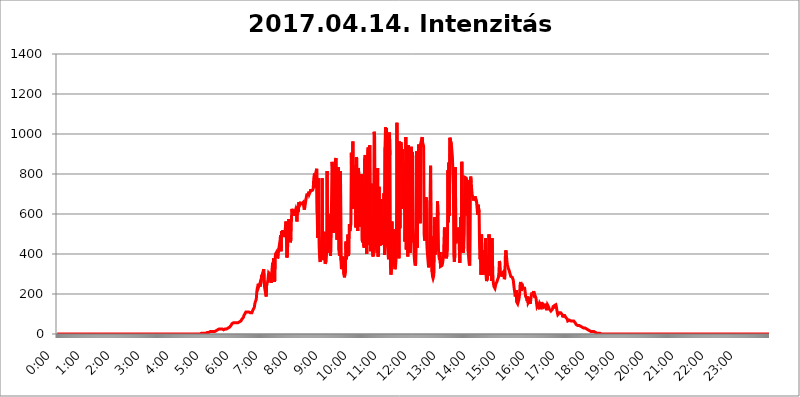
| Category | 2017.04.14. Intenzitás [W/m^2] |
|---|---|
| 0.0 | 0 |
| 0.0006944444444444445 | 0 |
| 0.001388888888888889 | 0 |
| 0.0020833333333333333 | 0 |
| 0.002777777777777778 | 0 |
| 0.003472222222222222 | 0 |
| 0.004166666666666667 | 0 |
| 0.004861111111111111 | 0 |
| 0.005555555555555556 | 0 |
| 0.0062499999999999995 | 0 |
| 0.006944444444444444 | 0 |
| 0.007638888888888889 | 0 |
| 0.008333333333333333 | 0 |
| 0.009027777777777779 | 0 |
| 0.009722222222222222 | 0 |
| 0.010416666666666666 | 0 |
| 0.011111111111111112 | 0 |
| 0.011805555555555555 | 0 |
| 0.012499999999999999 | 0 |
| 0.013194444444444444 | 0 |
| 0.013888888888888888 | 0 |
| 0.014583333333333332 | 0 |
| 0.015277777777777777 | 0 |
| 0.015972222222222224 | 0 |
| 0.016666666666666666 | 0 |
| 0.017361111111111112 | 0 |
| 0.018055555555555557 | 0 |
| 0.01875 | 0 |
| 0.019444444444444445 | 0 |
| 0.02013888888888889 | 0 |
| 0.020833333333333332 | 0 |
| 0.02152777777777778 | 0 |
| 0.022222222222222223 | 0 |
| 0.02291666666666667 | 0 |
| 0.02361111111111111 | 0 |
| 0.024305555555555556 | 0 |
| 0.024999999999999998 | 0 |
| 0.025694444444444447 | 0 |
| 0.02638888888888889 | 0 |
| 0.027083333333333334 | 0 |
| 0.027777777777777776 | 0 |
| 0.02847222222222222 | 0 |
| 0.029166666666666664 | 0 |
| 0.029861111111111113 | 0 |
| 0.030555555555555555 | 0 |
| 0.03125 | 0 |
| 0.03194444444444445 | 0 |
| 0.03263888888888889 | 0 |
| 0.03333333333333333 | 0 |
| 0.034027777777777775 | 0 |
| 0.034722222222222224 | 0 |
| 0.035416666666666666 | 0 |
| 0.036111111111111115 | 0 |
| 0.03680555555555556 | 0 |
| 0.0375 | 0 |
| 0.03819444444444444 | 0 |
| 0.03888888888888889 | 0 |
| 0.03958333333333333 | 0 |
| 0.04027777777777778 | 0 |
| 0.04097222222222222 | 0 |
| 0.041666666666666664 | 0 |
| 0.042361111111111106 | 0 |
| 0.04305555555555556 | 0 |
| 0.043750000000000004 | 0 |
| 0.044444444444444446 | 0 |
| 0.04513888888888889 | 0 |
| 0.04583333333333334 | 0 |
| 0.04652777777777778 | 0 |
| 0.04722222222222222 | 0 |
| 0.04791666666666666 | 0 |
| 0.04861111111111111 | 0 |
| 0.049305555555555554 | 0 |
| 0.049999999999999996 | 0 |
| 0.05069444444444445 | 0 |
| 0.051388888888888894 | 0 |
| 0.052083333333333336 | 0 |
| 0.05277777777777778 | 0 |
| 0.05347222222222222 | 0 |
| 0.05416666666666667 | 0 |
| 0.05486111111111111 | 0 |
| 0.05555555555555555 | 0 |
| 0.05625 | 0 |
| 0.05694444444444444 | 0 |
| 0.057638888888888885 | 0 |
| 0.05833333333333333 | 0 |
| 0.05902777777777778 | 0 |
| 0.059722222222222225 | 0 |
| 0.06041666666666667 | 0 |
| 0.061111111111111116 | 0 |
| 0.06180555555555556 | 0 |
| 0.0625 | 0 |
| 0.06319444444444444 | 0 |
| 0.06388888888888888 | 0 |
| 0.06458333333333334 | 0 |
| 0.06527777777777778 | 0 |
| 0.06597222222222222 | 0 |
| 0.06666666666666667 | 0 |
| 0.06736111111111111 | 0 |
| 0.06805555555555555 | 0 |
| 0.06874999999999999 | 0 |
| 0.06944444444444443 | 0 |
| 0.07013888888888889 | 0 |
| 0.07083333333333333 | 0 |
| 0.07152777777777779 | 0 |
| 0.07222222222222223 | 0 |
| 0.07291666666666667 | 0 |
| 0.07361111111111111 | 0 |
| 0.07430555555555556 | 0 |
| 0.075 | 0 |
| 0.07569444444444444 | 0 |
| 0.0763888888888889 | 0 |
| 0.07708333333333334 | 0 |
| 0.07777777777777778 | 0 |
| 0.07847222222222222 | 0 |
| 0.07916666666666666 | 0 |
| 0.0798611111111111 | 0 |
| 0.08055555555555556 | 0 |
| 0.08125 | 0 |
| 0.08194444444444444 | 0 |
| 0.08263888888888889 | 0 |
| 0.08333333333333333 | 0 |
| 0.08402777777777777 | 0 |
| 0.08472222222222221 | 0 |
| 0.08541666666666665 | 0 |
| 0.08611111111111112 | 0 |
| 0.08680555555555557 | 0 |
| 0.08750000000000001 | 0 |
| 0.08819444444444445 | 0 |
| 0.08888888888888889 | 0 |
| 0.08958333333333333 | 0 |
| 0.09027777777777778 | 0 |
| 0.09097222222222222 | 0 |
| 0.09166666666666667 | 0 |
| 0.09236111111111112 | 0 |
| 0.09305555555555556 | 0 |
| 0.09375 | 0 |
| 0.09444444444444444 | 0 |
| 0.09513888888888888 | 0 |
| 0.09583333333333333 | 0 |
| 0.09652777777777777 | 0 |
| 0.09722222222222222 | 0 |
| 0.09791666666666667 | 0 |
| 0.09861111111111111 | 0 |
| 0.09930555555555555 | 0 |
| 0.09999999999999999 | 0 |
| 0.10069444444444443 | 0 |
| 0.1013888888888889 | 0 |
| 0.10208333333333335 | 0 |
| 0.10277777777777779 | 0 |
| 0.10347222222222223 | 0 |
| 0.10416666666666667 | 0 |
| 0.10486111111111111 | 0 |
| 0.10555555555555556 | 0 |
| 0.10625 | 0 |
| 0.10694444444444444 | 0 |
| 0.1076388888888889 | 0 |
| 0.10833333333333334 | 0 |
| 0.10902777777777778 | 0 |
| 0.10972222222222222 | 0 |
| 0.1111111111111111 | 0 |
| 0.11180555555555556 | 0 |
| 0.11180555555555556 | 0 |
| 0.1125 | 0 |
| 0.11319444444444444 | 0 |
| 0.11388888888888889 | 0 |
| 0.11458333333333333 | 0 |
| 0.11527777777777777 | 0 |
| 0.11597222222222221 | 0 |
| 0.11666666666666665 | 0 |
| 0.1173611111111111 | 0 |
| 0.11805555555555557 | 0 |
| 0.11944444444444445 | 0 |
| 0.12013888888888889 | 0 |
| 0.12083333333333333 | 0 |
| 0.12152777777777778 | 0 |
| 0.12222222222222223 | 0 |
| 0.12291666666666667 | 0 |
| 0.12291666666666667 | 0 |
| 0.12361111111111112 | 0 |
| 0.12430555555555556 | 0 |
| 0.125 | 0 |
| 0.12569444444444444 | 0 |
| 0.12638888888888888 | 0 |
| 0.12708333333333333 | 0 |
| 0.16875 | 0 |
| 0.12847222222222224 | 0 |
| 0.12916666666666668 | 0 |
| 0.12986111111111112 | 0 |
| 0.13055555555555556 | 0 |
| 0.13125 | 0 |
| 0.13194444444444445 | 0 |
| 0.1326388888888889 | 0 |
| 0.13333333333333333 | 0 |
| 0.13402777777777777 | 0 |
| 0.13402777777777777 | 0 |
| 0.13472222222222222 | 0 |
| 0.13541666666666666 | 0 |
| 0.1361111111111111 | 0 |
| 0.13749999999999998 | 0 |
| 0.13819444444444443 | 0 |
| 0.1388888888888889 | 0 |
| 0.13958333333333334 | 0 |
| 0.14027777777777778 | 0 |
| 0.14097222222222222 | 0 |
| 0.14166666666666666 | 0 |
| 0.1423611111111111 | 0 |
| 0.14305555555555557 | 0 |
| 0.14375000000000002 | 0 |
| 0.14444444444444446 | 0 |
| 0.1451388888888889 | 0 |
| 0.1451388888888889 | 0 |
| 0.14652777777777778 | 0 |
| 0.14722222222222223 | 0 |
| 0.14791666666666667 | 0 |
| 0.1486111111111111 | 0 |
| 0.14930555555555555 | 0 |
| 0.15 | 0 |
| 0.15069444444444444 | 0 |
| 0.15138888888888888 | 0 |
| 0.15208333333333332 | 0 |
| 0.15277777777777776 | 0 |
| 0.15347222222222223 | 0 |
| 0.15416666666666667 | 0 |
| 0.15486111111111112 | 0 |
| 0.15555555555555556 | 0 |
| 0.15625 | 0 |
| 0.15694444444444444 | 0 |
| 0.15763888888888888 | 0 |
| 0.15833333333333333 | 0 |
| 0.15902777777777777 | 0 |
| 0.15972222222222224 | 0 |
| 0.16041666666666668 | 0 |
| 0.16111111111111112 | 0 |
| 0.16180555555555556 | 0 |
| 0.1625 | 0 |
| 0.16319444444444445 | 0 |
| 0.1638888888888889 | 0 |
| 0.16458333333333333 | 0 |
| 0.16527777777777777 | 0 |
| 0.16597222222222222 | 0 |
| 0.16666666666666666 | 0 |
| 0.1673611111111111 | 0 |
| 0.16805555555555554 | 0 |
| 0.16874999999999998 | 0 |
| 0.16944444444444443 | 0 |
| 0.17013888888888887 | 0 |
| 0.1708333333333333 | 0 |
| 0.17152777777777775 | 0 |
| 0.17222222222222225 | 0 |
| 0.1729166666666667 | 0 |
| 0.17361111111111113 | 0 |
| 0.17430555555555557 | 0 |
| 0.17500000000000002 | 0 |
| 0.17569444444444446 | 0 |
| 0.1763888888888889 | 0 |
| 0.17708333333333334 | 0 |
| 0.17777777777777778 | 0 |
| 0.17847222222222223 | 0 |
| 0.17916666666666667 | 0 |
| 0.1798611111111111 | 0 |
| 0.18055555555555555 | 0 |
| 0.18125 | 0 |
| 0.18194444444444444 | 0 |
| 0.1826388888888889 | 0 |
| 0.18333333333333335 | 0 |
| 0.1840277777777778 | 0 |
| 0.18472222222222223 | 0 |
| 0.18541666666666667 | 0 |
| 0.18611111111111112 | 0 |
| 0.18680555555555556 | 0 |
| 0.1875 | 0 |
| 0.18819444444444444 | 0 |
| 0.18888888888888888 | 0 |
| 0.18958333333333333 | 0 |
| 0.19027777777777777 | 0 |
| 0.1909722222222222 | 0 |
| 0.19166666666666665 | 0 |
| 0.19236111111111112 | 0 |
| 0.19305555555555554 | 0 |
| 0.19375 | 0 |
| 0.19444444444444445 | 0 |
| 0.1951388888888889 | 0 |
| 0.19583333333333333 | 0 |
| 0.19652777777777777 | 0 |
| 0.19722222222222222 | 0 |
| 0.19791666666666666 | 0 |
| 0.1986111111111111 | 0 |
| 0.19930555555555554 | 0 |
| 0.19999999999999998 | 0 |
| 0.20069444444444443 | 0 |
| 0.20138888888888887 | 3.525 |
| 0.2020833333333333 | 3.525 |
| 0.2027777777777778 | 3.525 |
| 0.2034722222222222 | 3.525 |
| 0.2041666666666667 | 3.525 |
| 0.20486111111111113 | 3.525 |
| 0.20555555555555557 | 3.525 |
| 0.20625000000000002 | 3.525 |
| 0.20694444444444446 | 3.525 |
| 0.2076388888888889 | 3.525 |
| 0.20833333333333334 | 3.525 |
| 0.20902777777777778 | 7.887 |
| 0.20972222222222223 | 7.887 |
| 0.21041666666666667 | 7.887 |
| 0.2111111111111111 | 7.887 |
| 0.21180555555555555 | 7.887 |
| 0.2125 | 7.887 |
| 0.21319444444444444 | 12.257 |
| 0.2138888888888889 | 12.257 |
| 0.21458333333333335 | 12.257 |
| 0.2152777777777778 | 12.257 |
| 0.21597222222222223 | 12.257 |
| 0.21666666666666667 | 12.257 |
| 0.21736111111111112 | 12.257 |
| 0.21805555555555556 | 12.257 |
| 0.21875 | 12.257 |
| 0.21944444444444444 | 12.257 |
| 0.22013888888888888 | 12.257 |
| 0.22083333333333333 | 12.257 |
| 0.22152777777777777 | 12.257 |
| 0.2222222222222222 | 16.636 |
| 0.22291666666666665 | 16.636 |
| 0.2236111111111111 | 21.024 |
| 0.22430555555555556 | 21.024 |
| 0.225 | 21.024 |
| 0.22569444444444445 | 21.024 |
| 0.2263888888888889 | 25.419 |
| 0.22708333333333333 | 25.419 |
| 0.22777777777777777 | 25.419 |
| 0.22847222222222222 | 25.419 |
| 0.22916666666666666 | 25.419 |
| 0.2298611111111111 | 25.419 |
| 0.23055555555555554 | 25.419 |
| 0.23124999999999998 | 25.419 |
| 0.23194444444444443 | 25.419 |
| 0.23263888888888887 | 21.024 |
| 0.2333333333333333 | 21.024 |
| 0.2340277777777778 | 25.419 |
| 0.2347222222222222 | 25.419 |
| 0.2354166666666667 | 25.419 |
| 0.23611111111111113 | 25.419 |
| 0.23680555555555557 | 25.419 |
| 0.23750000000000002 | 25.419 |
| 0.23819444444444446 | 25.419 |
| 0.2388888888888889 | 29.823 |
| 0.23958333333333334 | 29.823 |
| 0.24027777777777778 | 29.823 |
| 0.24097222222222223 | 34.234 |
| 0.24166666666666667 | 34.234 |
| 0.2423611111111111 | 38.653 |
| 0.24305555555555555 | 38.653 |
| 0.24375 | 43.079 |
| 0.24444444444444446 | 47.511 |
| 0.24513888888888888 | 51.951 |
| 0.24583333333333335 | 56.398 |
| 0.2465277777777778 | 56.398 |
| 0.24722222222222223 | 56.398 |
| 0.24791666666666667 | 56.398 |
| 0.24861111111111112 | 56.398 |
| 0.24930555555555556 | 56.398 |
| 0.25 | 56.398 |
| 0.25069444444444444 | 56.398 |
| 0.2513888888888889 | 56.398 |
| 0.2520833333333333 | 56.398 |
| 0.25277777777777777 | 56.398 |
| 0.2534722222222222 | 56.398 |
| 0.25416666666666665 | 56.398 |
| 0.2548611111111111 | 56.398 |
| 0.2555555555555556 | 60.85 |
| 0.25625000000000003 | 60.85 |
| 0.2569444444444445 | 65.31 |
| 0.2576388888888889 | 65.31 |
| 0.25833333333333336 | 69.775 |
| 0.2590277777777778 | 74.246 |
| 0.25972222222222224 | 74.246 |
| 0.2604166666666667 | 78.722 |
| 0.2611111111111111 | 83.205 |
| 0.26180555555555557 | 92.184 |
| 0.2625 | 96.682 |
| 0.26319444444444445 | 101.184 |
| 0.2638888888888889 | 105.69 |
| 0.26458333333333334 | 110.201 |
| 0.2652777777777778 | 105.69 |
| 0.2659722222222222 | 110.201 |
| 0.26666666666666666 | 110.201 |
| 0.2673611111111111 | 114.716 |
| 0.26805555555555555 | 114.716 |
| 0.26875 | 110.201 |
| 0.26944444444444443 | 110.201 |
| 0.2701388888888889 | 105.69 |
| 0.2708333333333333 | 105.69 |
| 0.27152777777777776 | 105.69 |
| 0.2722222222222222 | 101.184 |
| 0.27291666666666664 | 105.69 |
| 0.2736111111111111 | 110.201 |
| 0.2743055555555555 | 119.235 |
| 0.27499999999999997 | 119.235 |
| 0.27569444444444446 | 123.758 |
| 0.27638888888888885 | 132.814 |
| 0.27708333333333335 | 150.964 |
| 0.2777777777777778 | 160.056 |
| 0.27847222222222223 | 160.056 |
| 0.2791666666666667 | 173.709 |
| 0.2798611111111111 | 210.182 |
| 0.28055555555555556 | 228.436 |
| 0.28125 | 237.564 |
| 0.28194444444444444 | 251.251 |
| 0.2826388888888889 | 237.564 |
| 0.2833333333333333 | 242.127 |
| 0.28402777777777777 | 251.251 |
| 0.2847222222222222 | 237.564 |
| 0.28541666666666665 | 242.127 |
| 0.28611111111111115 | 274.047 |
| 0.28680555555555554 | 296.808 |
| 0.28750000000000003 | 287.709 |
| 0.2881944444444445 | 305.898 |
| 0.2888888888888889 | 305.898 |
| 0.28958333333333336 | 324.052 |
| 0.2902777777777778 | 255.813 |
| 0.29097222222222224 | 228.436 |
| 0.2916666666666667 | 233 |
| 0.2923611111111111 | 201.058 |
| 0.29305555555555557 | 187.378 |
| 0.29375 | 251.251 |
| 0.29444444444444445 | 246.689 |
| 0.2951388888888889 | 260.373 |
| 0.29583333333333334 | 255.813 |
| 0.2965277777777778 | 305.898 |
| 0.2972222222222222 | 305.898 |
| 0.29791666666666666 | 310.44 |
| 0.2986111111111111 | 296.808 |
| 0.29930555555555555 | 296.808 |
| 0.3 | 255.813 |
| 0.30069444444444443 | 296.808 |
| 0.3013888888888889 | 328.584 |
| 0.3020833333333333 | 355.712 |
| 0.30277777777777776 | 342.162 |
| 0.3034722222222222 | 378.224 |
| 0.30416666666666664 | 296.808 |
| 0.3048611111111111 | 260.373 |
| 0.3055555555555555 | 378.224 |
| 0.30624999999999997 | 400.638 |
| 0.3069444444444444 | 400.638 |
| 0.3076388888888889 | 409.574 |
| 0.30833333333333335 | 396.164 |
| 0.3090277777777778 | 378.224 |
| 0.30972222222222223 | 387.202 |
| 0.3104166666666667 | 418.492 |
| 0.3111111111111111 | 418.492 |
| 0.31180555555555556 | 422.943 |
| 0.3125 | 467.187 |
| 0.31319444444444444 | 493.475 |
| 0.3138888888888889 | 414.035 |
| 0.3145833333333333 | 515.223 |
| 0.31527777777777777 | 506.542 |
| 0.3159722222222222 | 497.836 |
| 0.31666666666666665 | 519.555 |
| 0.31736111111111115 | 515.223 |
| 0.31805555555555554 | 484.735 |
| 0.31875000000000003 | 493.475 |
| 0.3194444444444445 | 502.192 |
| 0.3201388888888889 | 541.121 |
| 0.32083333333333336 | 562.53 |
| 0.3215277777777778 | 558.261 |
| 0.32222222222222224 | 382.715 |
| 0.3229166666666667 | 418.492 |
| 0.3236111111111111 | 471.582 |
| 0.32430555555555557 | 462.786 |
| 0.325 | 575.299 |
| 0.32569444444444445 | 462.786 |
| 0.3263888888888889 | 541.121 |
| 0.32708333333333334 | 458.38 |
| 0.3277777777777778 | 480.356 |
| 0.3284722222222222 | 575.299 |
| 0.32916666666666666 | 625.784 |
| 0.3298611111111111 | 609.062 |
| 0.33055555555555555 | 596.45 |
| 0.33125 | 621.613 |
| 0.33194444444444443 | 592.233 |
| 0.3326388888888889 | 592.233 |
| 0.3333333333333333 | 604.864 |
| 0.3340277777777778 | 617.436 |
| 0.3347222222222222 | 625.784 |
| 0.3354166666666667 | 617.436 |
| 0.3361111111111111 | 562.53 |
| 0.3368055555555556 | 629.948 |
| 0.33749999999999997 | 638.256 |
| 0.33819444444444446 | 609.062 |
| 0.33888888888888885 | 658.909 |
| 0.33958333333333335 | 642.4 |
| 0.34027777777777773 | 642.4 |
| 0.34097222222222223 | 654.791 |
| 0.3416666666666666 | 650.667 |
| 0.3423611111111111 | 650.667 |
| 0.3430555555555555 | 650.667 |
| 0.34375 | 654.791 |
| 0.3444444444444445 | 650.667 |
| 0.3451388888888889 | 658.909 |
| 0.3458333333333334 | 634.105 |
| 0.34652777777777777 | 621.613 |
| 0.34722222222222227 | 634.105 |
| 0.34791666666666665 | 650.667 |
| 0.34861111111111115 | 667.123 |
| 0.34930555555555554 | 683.473 |
| 0.35000000000000003 | 695.666 |
| 0.3506944444444444 | 699.717 |
| 0.3513888888888889 | 691.608 |
| 0.3520833333333333 | 695.666 |
| 0.3527777777777778 | 711.832 |
| 0.3534722222222222 | 699.717 |
| 0.3541666666666667 | 703.762 |
| 0.3548611111111111 | 711.832 |
| 0.35555555555555557 | 723.889 |
| 0.35625 | 715.858 |
| 0.35694444444444445 | 719.877 |
| 0.3576388888888889 | 715.858 |
| 0.35833333333333334 | 719.877 |
| 0.3590277777777778 | 727.896 |
| 0.3597222222222222 | 775.492 |
| 0.36041666666666666 | 795.074 |
| 0.3611111111111111 | 802.868 |
| 0.36180555555555555 | 731.896 |
| 0.3625 | 727.896 |
| 0.36319444444444443 | 814.519 |
| 0.3638888888888889 | 826.123 |
| 0.3645833333333333 | 604.864 |
| 0.3652777777777778 | 480.356 |
| 0.3659722222222222 | 779.42 |
| 0.3666666666666667 | 575.299 |
| 0.3673611111111111 | 436.27 |
| 0.3680555555555556 | 378.224 |
| 0.36874999999999997 | 360.221 |
| 0.36944444444444446 | 360.221 |
| 0.37013888888888885 | 405.108 |
| 0.37083333333333335 | 489.108 |
| 0.37152777777777773 | 779.42 |
| 0.37222222222222223 | 414.035 |
| 0.3729166666666666 | 369.23 |
| 0.3736111111111111 | 396.164 |
| 0.3743055555555555 | 510.885 |
| 0.375 | 387.202 |
| 0.3756944444444445 | 351.198 |
| 0.3763888888888889 | 346.682 |
| 0.3770833333333334 | 364.728 |
| 0.37777777777777777 | 409.574 |
| 0.37847222222222227 | 814.519 |
| 0.37916666666666665 | 475.972 |
| 0.37986111111111115 | 600.661 |
| 0.38055555555555554 | 480.356 |
| 0.38125000000000003 | 558.261 |
| 0.3819444444444444 | 405.108 |
| 0.3826388888888889 | 515.223 |
| 0.3833333333333333 | 391.685 |
| 0.3840277777777778 | 532.513 |
| 0.3847222222222222 | 667.123 |
| 0.3854166666666667 | 860.676 |
| 0.3861111111111111 | 864.493 |
| 0.38680555555555557 | 795.074 |
| 0.3875 | 506.542 |
| 0.38819444444444445 | 502.192 |
| 0.3888888888888889 | 771.559 |
| 0.38958333333333334 | 837.682 |
| 0.3902777777777778 | 872.114 |
| 0.3909722222222222 | 879.719 |
| 0.39166666666666666 | 515.223 |
| 0.3923611111111111 | 471.582 |
| 0.39305555555555555 | 467.187 |
| 0.39375 | 604.864 |
| 0.39444444444444443 | 833.834 |
| 0.3951388888888889 | 418.492 |
| 0.3958333333333333 | 391.685 |
| 0.3965277777777778 | 414.035 |
| 0.3972222222222222 | 814.519 |
| 0.3979166666666667 | 369.23 |
| 0.3986111111111111 | 324.052 |
| 0.3993055555555556 | 328.584 |
| 0.39999999999999997 | 369.23 |
| 0.40069444444444446 | 387.202 |
| 0.40138888888888885 | 382.715 |
| 0.40208333333333335 | 296.808 |
| 0.40277777777777773 | 283.156 |
| 0.40347222222222223 | 283.156 |
| 0.4041666666666666 | 314.98 |
| 0.4048611111111111 | 462.786 |
| 0.4055555555555555 | 373.729 |
| 0.40625 | 400.638 |
| 0.4069444444444445 | 409.574 |
| 0.4076388888888889 | 497.836 |
| 0.4083333333333334 | 391.685 |
| 0.40902777777777777 | 405.108 |
| 0.40972222222222227 | 549.704 |
| 0.41041666666666665 | 515.223 |
| 0.41111111111111115 | 532.513 |
| 0.41180555555555554 | 549.704 |
| 0.41250000000000003 | 906.223 |
| 0.4131944444444444 | 646.537 |
| 0.4138888888888889 | 719.877 |
| 0.4145833333333333 | 962.555 |
| 0.4152777777777778 | 625.784 |
| 0.4159722222222222 | 719.877 |
| 0.4166666666666667 | 845.365 |
| 0.4173611111111111 | 849.199 |
| 0.41805555555555557 | 751.803 |
| 0.41875 | 532.513 |
| 0.41944444444444445 | 883.516 |
| 0.4201388888888889 | 875.918 |
| 0.42083333333333334 | 545.416 |
| 0.4215277777777778 | 515.223 |
| 0.4222222222222222 | 829.981 |
| 0.42291666666666666 | 802.868 |
| 0.4236111111111111 | 767.62 |
| 0.42430555555555555 | 691.608 |
| 0.425 | 536.82 |
| 0.42569444444444443 | 671.22 |
| 0.4263888888888889 | 646.537 |
| 0.4270833333333333 | 798.974 |
| 0.4277777777777778 | 467.187 |
| 0.4284722222222222 | 458.38 |
| 0.4291666666666667 | 519.555 |
| 0.4298611111111111 | 440.702 |
| 0.4305555555555556 | 431.833 |
| 0.43124999999999997 | 875.918 |
| 0.43194444444444446 | 894.885 |
| 0.43263888888888885 | 436.27 |
| 0.43333333333333335 | 894.885 |
| 0.43402777777777773 | 400.638 |
| 0.43472222222222223 | 759.723 |
| 0.4354166666666666 | 909.996 |
| 0.4361111111111111 | 932.576 |
| 0.4368055555555555 | 458.38 |
| 0.4375 | 445.129 |
| 0.4381944444444445 | 943.832 |
| 0.4388888888888889 | 604.864 |
| 0.4395833333333334 | 414.035 |
| 0.44027777777777777 | 751.803 |
| 0.44097222222222227 | 497.836 |
| 0.44166666666666665 | 467.187 |
| 0.44236111111111115 | 396.164 |
| 0.44305555555555554 | 387.202 |
| 0.44375000000000003 | 449.551 |
| 0.4444444444444444 | 1011.118 |
| 0.4451388888888889 | 988.714 |
| 0.4458333333333333 | 571.049 |
| 0.4465277777777778 | 471.582 |
| 0.4472222222222222 | 440.702 |
| 0.4479166666666667 | 445.129 |
| 0.4486111111111111 | 405.108 |
| 0.44930555555555557 | 829.981 |
| 0.45 | 387.202 |
| 0.45069444444444445 | 414.035 |
| 0.4513888888888889 | 735.89 |
| 0.45208333333333334 | 458.38 |
| 0.4527777777777778 | 440.702 |
| 0.4534722222222222 | 493.475 |
| 0.45416666666666666 | 675.311 |
| 0.4548611111111111 | 471.582 |
| 0.45555555555555555 | 471.582 |
| 0.45625 | 484.735 |
| 0.45694444444444443 | 445.129 |
| 0.4576388888888889 | 445.129 |
| 0.4583333333333333 | 703.762 |
| 0.4590277777777778 | 396.164 |
| 0.4597222222222222 | 932.576 |
| 0.4604166666666667 | 1033.537 |
| 0.4611111111111111 | 925.06 |
| 0.4618055555555556 | 1029.798 |
| 0.46249999999999997 | 600.661 |
| 0.46319444444444446 | 440.702 |
| 0.46388888888888885 | 405.108 |
| 0.46458333333333335 | 373.729 |
| 0.46527777777777773 | 445.129 |
| 0.46597222222222223 | 1007.383 |
| 0.4666666666666666 | 894.885 |
| 0.4673611111111111 | 333.113 |
| 0.4680555555555555 | 296.808 |
| 0.46875 | 328.584 |
| 0.4694444444444445 | 562.53 |
| 0.4701388888888889 | 391.685 |
| 0.4708333333333334 | 373.729 |
| 0.47152777777777777 | 400.638 |
| 0.47222222222222227 | 523.88 |
| 0.47291666666666665 | 342.162 |
| 0.47361111111111115 | 324.052 |
| 0.47430555555555554 | 333.113 |
| 0.47500000000000003 | 364.728 |
| 0.4756944444444444 | 409.574 |
| 0.4763888888888889 | 1056.004 |
| 0.4770833333333333 | 683.473 |
| 0.4777777777777778 | 467.187 |
| 0.4784722222222222 | 898.668 |
| 0.4791666666666667 | 378.224 |
| 0.4798611111111111 | 962.555 |
| 0.48055555555555557 | 528.2 |
| 0.48125 | 894.885 |
| 0.48194444444444445 | 958.814 |
| 0.4826388888888889 | 940.082 |
| 0.48333333333333334 | 887.309 |
| 0.4840277777777778 | 925.06 |
| 0.4847222222222222 | 625.784 |
| 0.48541666666666666 | 671.22 |
| 0.4861111111111111 | 864.493 |
| 0.48680555555555555 | 739.877 |
| 0.4875 | 462.786 |
| 0.48819444444444443 | 553.986 |
| 0.4888888888888889 | 984.98 |
| 0.4895833333333333 | 422.943 |
| 0.4902777777777778 | 795.074 |
| 0.4909722222222222 | 445.129 |
| 0.4916666666666667 | 387.202 |
| 0.4923611111111111 | 943.832 |
| 0.4930555555555556 | 743.859 |
| 0.49374999999999997 | 699.717 |
| 0.49444444444444446 | 418.492 |
| 0.49513888888888885 | 405.108 |
| 0.49583333333333335 | 506.542 |
| 0.49652777777777773 | 936.33 |
| 0.49722222222222223 | 458.38 |
| 0.4979166666666666 | 909.996 |
| 0.4986111111111111 | 883.516 |
| 0.4993055555555555 | 528.2 |
| 0.5 | 462.786 |
| 0.5006944444444444 | 387.202 |
| 0.5013888888888889 | 355.712 |
| 0.5020833333333333 | 342.162 |
| 0.5027777777777778 | 351.198 |
| 0.5034722222222222 | 462.786 |
| 0.5041666666666667 | 913.766 |
| 0.5048611111111111 | 431.833 |
| 0.5055555555555555 | 719.877 |
| 0.50625 | 853.029 |
| 0.5069444444444444 | 947.58 |
| 0.5076388888888889 | 947.58 |
| 0.5083333333333333 | 675.311 |
| 0.5090277777777777 | 553.986 |
| 0.5097222222222222 | 951.327 |
| 0.5104166666666666 | 951.327 |
| 0.5111111111111112 | 973.772 |
| 0.5118055555555555 | 984.98 |
| 0.5125000000000001 | 955.071 |
| 0.5131944444444444 | 947.58 |
| 0.513888888888889 | 936.33 |
| 0.5145833333333333 | 497.836 |
| 0.5152777777777778 | 467.187 |
| 0.5159722222222222 | 467.187 |
| 0.5166666666666667 | 549.704 |
| 0.517361111111111 | 683.473 |
| 0.5180555555555556 | 480.356 |
| 0.5187499999999999 | 422.943 |
| 0.5194444444444445 | 391.685 |
| 0.5201388888888888 | 360.221 |
| 0.5208333333333334 | 333.113 |
| 0.5215277777777778 | 346.682 |
| 0.5222222222222223 | 337.639 |
| 0.5229166666666667 | 667.123 |
| 0.5236111111111111 | 841.526 |
| 0.5243055555555556 | 396.164 |
| 0.525 | 489.108 |
| 0.5256944444444445 | 310.44 |
| 0.5263888888888889 | 287.709 |
| 0.5270833333333333 | 278.603 |
| 0.5277777777777778 | 287.709 |
| 0.5284722222222222 | 314.98 |
| 0.5291666666666667 | 583.779 |
| 0.5298611111111111 | 396.164 |
| 0.5305555555555556 | 427.39 |
| 0.53125 | 545.416 |
| 0.5319444444444444 | 427.39 |
| 0.5326388888888889 | 532.513 |
| 0.5333333333333333 | 663.019 |
| 0.5340277777777778 | 592.233 |
| 0.5347222222222222 | 418.492 |
| 0.5354166666666667 | 387.202 |
| 0.5361111111111111 | 369.23 |
| 0.5368055555555555 | 409.574 |
| 0.5375 | 337.639 |
| 0.5381944444444444 | 342.162 |
| 0.5388888888888889 | 337.639 |
| 0.5395833333333333 | 342.162 |
| 0.5402777777777777 | 351.198 |
| 0.5409722222222222 | 369.23 |
| 0.5416666666666666 | 382.715 |
| 0.5423611111111112 | 378.224 |
| 0.5430555555555555 | 532.513 |
| 0.5437500000000001 | 382.715 |
| 0.5444444444444444 | 400.638 |
| 0.545138888888889 | 391.685 |
| 0.5458333333333333 | 378.224 |
| 0.5465277777777778 | 396.164 |
| 0.5472222222222222 | 422.943 |
| 0.5479166666666667 | 818.392 |
| 0.548611111111111 | 558.261 |
| 0.5493055555555556 | 856.855 |
| 0.5499999999999999 | 592.233 |
| 0.5506944444444445 | 981.244 |
| 0.5513888888888888 | 977.508 |
| 0.5520833333333334 | 981.244 |
| 0.5527777777777778 | 947.58 |
| 0.5534722222222223 | 917.534 |
| 0.5541666666666667 | 887.309 |
| 0.5548611111111111 | 818.392 |
| 0.5555555555555556 | 755.766 |
| 0.55625 | 391.685 |
| 0.5569444444444445 | 360.221 |
| 0.5576388888888889 | 396.164 |
| 0.5583333333333333 | 833.834 |
| 0.5590277777777778 | 453.968 |
| 0.5597222222222222 | 449.551 |
| 0.5604166666666667 | 449.551 |
| 0.5611111111111111 | 480.356 |
| 0.5618055555555556 | 497.836 |
| 0.5625 | 532.513 |
| 0.5631944444444444 | 523.88 |
| 0.5638888888888889 | 431.833 |
| 0.5645833333333333 | 355.712 |
| 0.5652777777777778 | 355.712 |
| 0.5659722222222222 | 583.779 |
| 0.5666666666666667 | 409.574 |
| 0.5673611111111111 | 860.676 |
| 0.5680555555555555 | 549.704 |
| 0.56875 | 566.793 |
| 0.5694444444444444 | 405.108 |
| 0.5701388888888889 | 436.27 |
| 0.5708333333333333 | 506.542 |
| 0.5715277777777777 | 783.342 |
| 0.5722222222222222 | 787.258 |
| 0.5729166666666666 | 783.342 |
| 0.5736111111111112 | 779.42 |
| 0.5743055555555555 | 771.559 |
| 0.5750000000000001 | 592.233 |
| 0.5756944444444444 | 767.62 |
| 0.576388888888889 | 414.035 |
| 0.5770833333333333 | 378.224 |
| 0.5777777777777778 | 351.198 |
| 0.5784722222222222 | 342.162 |
| 0.5791666666666667 | 751.803 |
| 0.579861111111111 | 787.258 |
| 0.5805555555555556 | 759.723 |
| 0.5812499999999999 | 723.889 |
| 0.5819444444444445 | 695.666 |
| 0.5826388888888888 | 687.544 |
| 0.5833333333333334 | 679.395 |
| 0.5840277777777778 | 667.123 |
| 0.5847222222222223 | 683.473 |
| 0.5854166666666667 | 675.311 |
| 0.5861111111111111 | 687.544 |
| 0.5868055555555556 | 687.544 |
| 0.5875 | 683.473 |
| 0.5881944444444445 | 658.909 |
| 0.5888888888888889 | 658.909 |
| 0.5895833333333333 | 596.45 |
| 0.5902777777777778 | 646.537 |
| 0.5909722222222222 | 650.667 |
| 0.5916666666666667 | 609.062 |
| 0.5923611111111111 | 431.833 |
| 0.5930555555555556 | 373.729 |
| 0.59375 | 431.833 |
| 0.5944444444444444 | 296.808 |
| 0.5951388888888889 | 497.836 |
| 0.5958333333333333 | 314.98 |
| 0.5965277777777778 | 418.492 |
| 0.5972222222222222 | 296.808 |
| 0.5979166666666667 | 292.259 |
| 0.5986111111111111 | 409.574 |
| 0.5993055555555555 | 387.202 |
| 0.6 | 405.108 |
| 0.6006944444444444 | 480.356 |
| 0.6013888888888889 | 296.808 |
| 0.6020833333333333 | 264.932 |
| 0.6027777777777777 | 264.932 |
| 0.6034722222222222 | 278.603 |
| 0.6041666666666666 | 391.685 |
| 0.6048611111111112 | 292.259 |
| 0.6055555555555555 | 497.836 |
| 0.6062500000000001 | 458.38 |
| 0.6069444444444444 | 475.972 |
| 0.607638888888889 | 440.702 |
| 0.6083333333333333 | 422.943 |
| 0.6090277777777778 | 264.932 |
| 0.6097222222222222 | 480.356 |
| 0.6104166666666667 | 369.23 |
| 0.611111111111111 | 274.047 |
| 0.6118055555555556 | 251.251 |
| 0.6124999999999999 | 237.564 |
| 0.6131944444444445 | 233 |
| 0.6138888888888888 | 228.436 |
| 0.6145833333333334 | 233 |
| 0.6152777777777778 | 251.251 |
| 0.6159722222222223 | 255.813 |
| 0.6166666666666667 | 260.373 |
| 0.6173611111111111 | 269.49 |
| 0.6180555555555556 | 274.047 |
| 0.61875 | 283.156 |
| 0.6194444444444445 | 305.898 |
| 0.6201388888888889 | 364.728 |
| 0.6208333333333333 | 351.198 |
| 0.6215277777777778 | 310.44 |
| 0.6222222222222222 | 287.709 |
| 0.6229166666666667 | 287.709 |
| 0.6236111111111111 | 301.354 |
| 0.6243055555555556 | 305.898 |
| 0.625 | 296.808 |
| 0.6256944444444444 | 310.44 |
| 0.6263888888888889 | 292.259 |
| 0.6270833333333333 | 274.047 |
| 0.6277777777777778 | 283.156 |
| 0.6284722222222222 | 387.202 |
| 0.6291666666666667 | 418.492 |
| 0.6298611111111111 | 396.164 |
| 0.6305555555555555 | 369.23 |
| 0.63125 | 346.682 |
| 0.6319444444444444 | 337.639 |
| 0.6326388888888889 | 328.584 |
| 0.6333333333333333 | 324.052 |
| 0.6340277777777777 | 314.98 |
| 0.6347222222222222 | 305.898 |
| 0.6354166666666666 | 296.808 |
| 0.6361111111111112 | 287.709 |
| 0.6368055555555555 | 287.709 |
| 0.6375000000000001 | 287.709 |
| 0.6381944444444444 | 283.156 |
| 0.638888888888889 | 278.603 |
| 0.6395833333333333 | 269.49 |
| 0.6402777777777778 | 269.49 |
| 0.6409722222222222 | 223.873 |
| 0.6416666666666667 | 210.182 |
| 0.642361111111111 | 187.378 |
| 0.6430555555555556 | 187.378 |
| 0.6437499999999999 | 219.309 |
| 0.6444444444444445 | 160.056 |
| 0.6451388888888888 | 155.509 |
| 0.6458333333333334 | 150.964 |
| 0.6465277777777778 | 155.509 |
| 0.6472222222222223 | 169.156 |
| 0.6479166666666667 | 182.82 |
| 0.6486111111111111 | 210.182 |
| 0.6493055555555556 | 251.251 |
| 0.65 | 260.373 |
| 0.6506944444444445 | 214.746 |
| 0.6513888888888889 | 251.251 |
| 0.6520833333333333 | 246.689 |
| 0.6527777777777778 | 237.564 |
| 0.6534722222222222 | 228.436 |
| 0.6541666666666667 | 223.873 |
| 0.6548611111111111 | 228.436 |
| 0.6555555555555556 | 228.436 |
| 0.65625 | 210.182 |
| 0.6569444444444444 | 187.378 |
| 0.6576388888888889 | 182.82 |
| 0.6583333333333333 | 178.264 |
| 0.6590277777777778 | 164.605 |
| 0.6597222222222222 | 187.378 |
| 0.6604166666666667 | 155.509 |
| 0.6611111111111111 | 155.509 |
| 0.6618055555555555 | 155.509 |
| 0.6625 | 169.156 |
| 0.6631944444444444 | 150.964 |
| 0.6638888888888889 | 164.605 |
| 0.6645833333333333 | 182.82 |
| 0.6652777777777777 | 201.058 |
| 0.6659722222222222 | 205.62 |
| 0.6666666666666666 | 201.058 |
| 0.6673611111111111 | 201.058 |
| 0.6680555555555556 | 214.746 |
| 0.6687500000000001 | 210.182 |
| 0.6694444444444444 | 182.82 |
| 0.6701388888888888 | 191.937 |
| 0.6708333333333334 | 187.378 |
| 0.6715277777777778 | 178.264 |
| 0.6722222222222222 | 155.509 |
| 0.6729166666666666 | 137.347 |
| 0.6736111111111112 | 137.347 |
| 0.6743055555555556 | 146.423 |
| 0.6749999999999999 | 150.964 |
| 0.6756944444444444 | 150.964 |
| 0.6763888888888889 | 123.758 |
| 0.6770833333333334 | 150.964 |
| 0.6777777777777777 | 155.509 |
| 0.6784722222222223 | 141.884 |
| 0.6791666666666667 | 160.056 |
| 0.6798611111111111 | 137.347 |
| 0.6805555555555555 | 155.509 |
| 0.68125 | 146.423 |
| 0.6819444444444445 | 132.814 |
| 0.6826388888888889 | 128.284 |
| 0.6833333333333332 | 137.347 |
| 0.6840277777777778 | 137.347 |
| 0.6847222222222222 | 141.884 |
| 0.6854166666666667 | 150.964 |
| 0.686111111111111 | 119.235 |
| 0.6868055555555556 | 132.814 |
| 0.6875 | 146.423 |
| 0.6881944444444444 | 146.423 |
| 0.688888888888889 | 137.347 |
| 0.6895833333333333 | 141.884 |
| 0.6902777777777778 | 123.758 |
| 0.6909722222222222 | 119.235 |
| 0.6916666666666668 | 119.235 |
| 0.6923611111111111 | 114.716 |
| 0.6930555555555555 | 114.716 |
| 0.69375 | 119.235 |
| 0.6944444444444445 | 123.758 |
| 0.6951388888888889 | 123.758 |
| 0.6958333333333333 | 141.884 |
| 0.6965277777777777 | 128.284 |
| 0.6972222222222223 | 141.884 |
| 0.6979166666666666 | 146.423 |
| 0.6986111111111111 | 141.884 |
| 0.6993055555555556 | 146.423 |
| 0.7000000000000001 | 137.347 |
| 0.7006944444444444 | 119.235 |
| 0.7013888888888888 | 114.716 |
| 0.7020833333333334 | 96.682 |
| 0.7027777777777778 | 92.184 |
| 0.7034722222222222 | 92.184 |
| 0.7041666666666666 | 105.69 |
| 0.7048611111111112 | 105.69 |
| 0.7055555555555556 | 110.201 |
| 0.7062499999999999 | 105.69 |
| 0.7069444444444444 | 105.69 |
| 0.7076388888888889 | 101.184 |
| 0.7083333333333334 | 96.682 |
| 0.7090277777777777 | 83.205 |
| 0.7097222222222223 | 92.184 |
| 0.7104166666666667 | 92.184 |
| 0.7111111111111111 | 92.184 |
| 0.7118055555555555 | 92.184 |
| 0.7125 | 87.692 |
| 0.7131944444444445 | 83.205 |
| 0.7138888888888889 | 83.205 |
| 0.7145833333333332 | 78.722 |
| 0.7152777777777778 | 74.246 |
| 0.7159722222222222 | 65.31 |
| 0.7166666666666667 | 65.31 |
| 0.717361111111111 | 69.775 |
| 0.7180555555555556 | 69.775 |
| 0.71875 | 69.775 |
| 0.7194444444444444 | 65.31 |
| 0.720138888888889 | 65.31 |
| 0.7208333333333333 | 65.31 |
| 0.7215277777777778 | 65.31 |
| 0.7222222222222222 | 65.31 |
| 0.7229166666666668 | 65.31 |
| 0.7236111111111111 | 65.31 |
| 0.7243055555555555 | 65.31 |
| 0.725 | 65.31 |
| 0.7256944444444445 | 65.31 |
| 0.7263888888888889 | 56.398 |
| 0.7270833333333333 | 51.951 |
| 0.7277777777777777 | 47.511 |
| 0.7284722222222223 | 47.511 |
| 0.7291666666666666 | 47.511 |
| 0.7298611111111111 | 43.079 |
| 0.7305555555555556 | 43.079 |
| 0.7312500000000001 | 43.079 |
| 0.7319444444444444 | 43.079 |
| 0.7326388888888888 | 38.653 |
| 0.7333333333333334 | 38.653 |
| 0.7340277777777778 | 38.653 |
| 0.7347222222222222 | 38.653 |
| 0.7354166666666666 | 34.234 |
| 0.7361111111111112 | 34.234 |
| 0.7368055555555556 | 34.234 |
| 0.7374999999999999 | 34.234 |
| 0.7381944444444444 | 29.823 |
| 0.7388888888888889 | 29.823 |
| 0.7395833333333334 | 29.823 |
| 0.7402777777777777 | 29.823 |
| 0.7409722222222223 | 25.419 |
| 0.7416666666666667 | 25.419 |
| 0.7423611111111111 | 25.419 |
| 0.7430555555555555 | 21.024 |
| 0.74375 | 21.024 |
| 0.7444444444444445 | 21.024 |
| 0.7451388888888889 | 21.024 |
| 0.7458333333333332 | 21.024 |
| 0.7465277777777778 | 16.636 |
| 0.7472222222222222 | 16.636 |
| 0.7479166666666667 | 16.636 |
| 0.748611111111111 | 12.257 |
| 0.7493055555555556 | 12.257 |
| 0.75 | 12.257 |
| 0.7506944444444444 | 12.257 |
| 0.751388888888889 | 12.257 |
| 0.7520833333333333 | 12.257 |
| 0.7527777777777778 | 12.257 |
| 0.7534722222222222 | 7.887 |
| 0.7541666666666668 | 7.887 |
| 0.7548611111111111 | 7.887 |
| 0.7555555555555555 | 7.887 |
| 0.75625 | 3.525 |
| 0.7569444444444445 | 3.525 |
| 0.7576388888888889 | 3.525 |
| 0.7583333333333333 | 3.525 |
| 0.7590277777777777 | 3.525 |
| 0.7597222222222223 | 3.525 |
| 0.7604166666666666 | 3.525 |
| 0.7611111111111111 | 3.525 |
| 0.7618055555555556 | 0 |
| 0.7625000000000001 | 0 |
| 0.7631944444444444 | 0 |
| 0.7638888888888888 | 0 |
| 0.7645833333333334 | 0 |
| 0.7652777777777778 | 0 |
| 0.7659722222222222 | 0 |
| 0.7666666666666666 | 0 |
| 0.7673611111111112 | 0 |
| 0.7680555555555556 | 0 |
| 0.7687499999999999 | 0 |
| 0.7694444444444444 | 0 |
| 0.7701388888888889 | 0 |
| 0.7708333333333334 | 0 |
| 0.7715277777777777 | 0 |
| 0.7722222222222223 | 0 |
| 0.7729166666666667 | 0 |
| 0.7736111111111111 | 0 |
| 0.7743055555555555 | 0 |
| 0.775 | 0 |
| 0.7756944444444445 | 0 |
| 0.7763888888888889 | 0 |
| 0.7770833333333332 | 0 |
| 0.7777777777777778 | 0 |
| 0.7784722222222222 | 0 |
| 0.7791666666666667 | 0 |
| 0.779861111111111 | 0 |
| 0.7805555555555556 | 0 |
| 0.78125 | 0 |
| 0.7819444444444444 | 0 |
| 0.782638888888889 | 0 |
| 0.7833333333333333 | 0 |
| 0.7840277777777778 | 0 |
| 0.7847222222222222 | 0 |
| 0.7854166666666668 | 0 |
| 0.7861111111111111 | 0 |
| 0.7868055555555555 | 0 |
| 0.7875 | 0 |
| 0.7881944444444445 | 0 |
| 0.7888888888888889 | 0 |
| 0.7895833333333333 | 0 |
| 0.7902777777777777 | 0 |
| 0.7909722222222223 | 0 |
| 0.7916666666666666 | 0 |
| 0.7923611111111111 | 0 |
| 0.7930555555555556 | 0 |
| 0.7937500000000001 | 0 |
| 0.7944444444444444 | 0 |
| 0.7951388888888888 | 0 |
| 0.7958333333333334 | 0 |
| 0.7965277777777778 | 0 |
| 0.7972222222222222 | 0 |
| 0.7979166666666666 | 0 |
| 0.7986111111111112 | 0 |
| 0.7993055555555556 | 0 |
| 0.7999999999999999 | 0 |
| 0.8006944444444444 | 0 |
| 0.8013888888888889 | 0 |
| 0.8020833333333334 | 0 |
| 0.8027777777777777 | 0 |
| 0.8034722222222223 | 0 |
| 0.8041666666666667 | 0 |
| 0.8048611111111111 | 0 |
| 0.8055555555555555 | 0 |
| 0.80625 | 0 |
| 0.8069444444444445 | 0 |
| 0.8076388888888889 | 0 |
| 0.8083333333333332 | 0 |
| 0.8090277777777778 | 0 |
| 0.8097222222222222 | 0 |
| 0.8104166666666667 | 0 |
| 0.811111111111111 | 0 |
| 0.8118055555555556 | 0 |
| 0.8125 | 0 |
| 0.8131944444444444 | 0 |
| 0.813888888888889 | 0 |
| 0.8145833333333333 | 0 |
| 0.8152777777777778 | 0 |
| 0.8159722222222222 | 0 |
| 0.8166666666666668 | 0 |
| 0.8173611111111111 | 0 |
| 0.8180555555555555 | 0 |
| 0.81875 | 0 |
| 0.8194444444444445 | 0 |
| 0.8201388888888889 | 0 |
| 0.8208333333333333 | 0 |
| 0.8215277777777777 | 0 |
| 0.8222222222222223 | 0 |
| 0.8229166666666666 | 0 |
| 0.8236111111111111 | 0 |
| 0.8243055555555556 | 0 |
| 0.8250000000000001 | 0 |
| 0.8256944444444444 | 0 |
| 0.8263888888888888 | 0 |
| 0.8270833333333334 | 0 |
| 0.8277777777777778 | 0 |
| 0.8284722222222222 | 0 |
| 0.8291666666666666 | 0 |
| 0.8298611111111112 | 0 |
| 0.8305555555555556 | 0 |
| 0.8312499999999999 | 0 |
| 0.8319444444444444 | 0 |
| 0.8326388888888889 | 0 |
| 0.8333333333333334 | 0 |
| 0.8340277777777777 | 0 |
| 0.8347222222222223 | 0 |
| 0.8354166666666667 | 0 |
| 0.8361111111111111 | 0 |
| 0.8368055555555555 | 0 |
| 0.8375 | 0 |
| 0.8381944444444445 | 0 |
| 0.8388888888888889 | 0 |
| 0.8395833333333332 | 0 |
| 0.8402777777777778 | 0 |
| 0.8409722222222222 | 0 |
| 0.8416666666666667 | 0 |
| 0.842361111111111 | 0 |
| 0.8430555555555556 | 0 |
| 0.84375 | 0 |
| 0.8444444444444444 | 0 |
| 0.845138888888889 | 0 |
| 0.8458333333333333 | 0 |
| 0.8465277777777778 | 0 |
| 0.8472222222222222 | 0 |
| 0.8479166666666668 | 0 |
| 0.8486111111111111 | 0 |
| 0.8493055555555555 | 0 |
| 0.85 | 0 |
| 0.8506944444444445 | 0 |
| 0.8513888888888889 | 0 |
| 0.8520833333333333 | 0 |
| 0.8527777777777777 | 0 |
| 0.8534722222222223 | 0 |
| 0.8541666666666666 | 0 |
| 0.8548611111111111 | 0 |
| 0.8555555555555556 | 0 |
| 0.8562500000000001 | 0 |
| 0.8569444444444444 | 0 |
| 0.8576388888888888 | 0 |
| 0.8583333333333334 | 0 |
| 0.8590277777777778 | 0 |
| 0.8597222222222222 | 0 |
| 0.8604166666666666 | 0 |
| 0.8611111111111112 | 0 |
| 0.8618055555555556 | 0 |
| 0.8624999999999999 | 0 |
| 0.8631944444444444 | 0 |
| 0.8638888888888889 | 0 |
| 0.8645833333333334 | 0 |
| 0.8652777777777777 | 0 |
| 0.8659722222222223 | 0 |
| 0.8666666666666667 | 0 |
| 0.8673611111111111 | 0 |
| 0.8680555555555555 | 0 |
| 0.86875 | 0 |
| 0.8694444444444445 | 0 |
| 0.8701388888888889 | 0 |
| 0.8708333333333332 | 0 |
| 0.8715277777777778 | 0 |
| 0.8722222222222222 | 0 |
| 0.8729166666666667 | 0 |
| 0.873611111111111 | 0 |
| 0.8743055555555556 | 0 |
| 0.875 | 0 |
| 0.8756944444444444 | 0 |
| 0.876388888888889 | 0 |
| 0.8770833333333333 | 0 |
| 0.8777777777777778 | 0 |
| 0.8784722222222222 | 0 |
| 0.8791666666666668 | 0 |
| 0.8798611111111111 | 0 |
| 0.8805555555555555 | 0 |
| 0.88125 | 0 |
| 0.8819444444444445 | 0 |
| 0.8826388888888889 | 0 |
| 0.8833333333333333 | 0 |
| 0.8840277777777777 | 0 |
| 0.8847222222222223 | 0 |
| 0.8854166666666666 | 0 |
| 0.8861111111111111 | 0 |
| 0.8868055555555556 | 0 |
| 0.8875000000000001 | 0 |
| 0.8881944444444444 | 0 |
| 0.8888888888888888 | 0 |
| 0.8895833333333334 | 0 |
| 0.8902777777777778 | 0 |
| 0.8909722222222222 | 0 |
| 0.8916666666666666 | 0 |
| 0.8923611111111112 | 0 |
| 0.8930555555555556 | 0 |
| 0.8937499999999999 | 0 |
| 0.8944444444444444 | 0 |
| 0.8951388888888889 | 0 |
| 0.8958333333333334 | 0 |
| 0.8965277777777777 | 0 |
| 0.8972222222222223 | 0 |
| 0.8979166666666667 | 0 |
| 0.8986111111111111 | 0 |
| 0.8993055555555555 | 0 |
| 0.9 | 0 |
| 0.9006944444444445 | 0 |
| 0.9013888888888889 | 0 |
| 0.9020833333333332 | 0 |
| 0.9027777777777778 | 0 |
| 0.9034722222222222 | 0 |
| 0.9041666666666667 | 0 |
| 0.904861111111111 | 0 |
| 0.9055555555555556 | 0 |
| 0.90625 | 0 |
| 0.9069444444444444 | 0 |
| 0.907638888888889 | 0 |
| 0.9083333333333333 | 0 |
| 0.9090277777777778 | 0 |
| 0.9097222222222222 | 0 |
| 0.9104166666666668 | 0 |
| 0.9111111111111111 | 0 |
| 0.9118055555555555 | 0 |
| 0.9125 | 0 |
| 0.9131944444444445 | 0 |
| 0.9138888888888889 | 0 |
| 0.9145833333333333 | 0 |
| 0.9152777777777777 | 0 |
| 0.9159722222222223 | 0 |
| 0.9166666666666666 | 0 |
| 0.9173611111111111 | 0 |
| 0.9180555555555556 | 0 |
| 0.9187500000000001 | 0 |
| 0.9194444444444444 | 0 |
| 0.9201388888888888 | 0 |
| 0.9208333333333334 | 0 |
| 0.9215277777777778 | 0 |
| 0.9222222222222222 | 0 |
| 0.9229166666666666 | 0 |
| 0.9236111111111112 | 0 |
| 0.9243055555555556 | 0 |
| 0.9249999999999999 | 0 |
| 0.9256944444444444 | 0 |
| 0.9263888888888889 | 0 |
| 0.9270833333333334 | 0 |
| 0.9277777777777777 | 0 |
| 0.9284722222222223 | 0 |
| 0.9291666666666667 | 0 |
| 0.9298611111111111 | 0 |
| 0.9305555555555555 | 0 |
| 0.93125 | 0 |
| 0.9319444444444445 | 0 |
| 0.9326388888888889 | 0 |
| 0.9333333333333332 | 0 |
| 0.9340277777777778 | 0 |
| 0.9347222222222222 | 0 |
| 0.9354166666666667 | 0 |
| 0.936111111111111 | 0 |
| 0.9368055555555556 | 0 |
| 0.9375 | 0 |
| 0.9381944444444444 | 0 |
| 0.938888888888889 | 0 |
| 0.9395833333333333 | 0 |
| 0.9402777777777778 | 0 |
| 0.9409722222222222 | 0 |
| 0.9416666666666668 | 0 |
| 0.9423611111111111 | 0 |
| 0.9430555555555555 | 0 |
| 0.94375 | 0 |
| 0.9444444444444445 | 0 |
| 0.9451388888888889 | 0 |
| 0.9458333333333333 | 0 |
| 0.9465277777777777 | 0 |
| 0.9472222222222223 | 0 |
| 0.9479166666666666 | 0 |
| 0.9486111111111111 | 0 |
| 0.9493055555555556 | 0 |
| 0.9500000000000001 | 0 |
| 0.9506944444444444 | 0 |
| 0.9513888888888888 | 0 |
| 0.9520833333333334 | 0 |
| 0.9527777777777778 | 0 |
| 0.9534722222222222 | 0 |
| 0.9541666666666666 | 0 |
| 0.9548611111111112 | 0 |
| 0.9555555555555556 | 0 |
| 0.9562499999999999 | 0 |
| 0.9569444444444444 | 0 |
| 0.9576388888888889 | 0 |
| 0.9583333333333334 | 0 |
| 0.9590277777777777 | 0 |
| 0.9597222222222223 | 0 |
| 0.9604166666666667 | 0 |
| 0.9611111111111111 | 0 |
| 0.9618055555555555 | 0 |
| 0.9625 | 0 |
| 0.9631944444444445 | 0 |
| 0.9638888888888889 | 0 |
| 0.9645833333333332 | 0 |
| 0.9652777777777778 | 0 |
| 0.9659722222222222 | 0 |
| 0.9666666666666667 | 0 |
| 0.967361111111111 | 0 |
| 0.9680555555555556 | 0 |
| 0.96875 | 0 |
| 0.9694444444444444 | 0 |
| 0.970138888888889 | 0 |
| 0.9708333333333333 | 0 |
| 0.9715277777777778 | 0 |
| 0.9722222222222222 | 0 |
| 0.9729166666666668 | 0 |
| 0.9736111111111111 | 0 |
| 0.9743055555555555 | 0 |
| 0.975 | 0 |
| 0.9756944444444445 | 0 |
| 0.9763888888888889 | 0 |
| 0.9770833333333333 | 0 |
| 0.9777777777777777 | 0 |
| 0.9784722222222223 | 0 |
| 0.9791666666666666 | 0 |
| 0.9798611111111111 | 0 |
| 0.9805555555555556 | 0 |
| 0.9812500000000001 | 0 |
| 0.9819444444444444 | 0 |
| 0.9826388888888888 | 0 |
| 0.9833333333333334 | 0 |
| 0.9840277777777778 | 0 |
| 0.9847222222222222 | 0 |
| 0.9854166666666666 | 0 |
| 0.9861111111111112 | 0 |
| 0.9868055555555556 | 0 |
| 0.9874999999999999 | 0 |
| 0.9881944444444444 | 0 |
| 0.9888888888888889 | 0 |
| 0.9895833333333334 | 0 |
| 0.9902777777777777 | 0 |
| 0.9909722222222223 | 0 |
| 0.9916666666666667 | 0 |
| 0.9923611111111111 | 0 |
| 0.9930555555555555 | 0 |
| 0.99375 | 0 |
| 0.9944444444444445 | 0 |
| 0.9951388888888889 | 0 |
| 0.9958333333333332 | 0 |
| 0.9965277777777778 | 0 |
| 0.9972222222222222 | 0 |
| 0.9979166666666667 | 0 |
| 0.998611111111111 | 0 |
| 0.9993055555555556 | 0 |